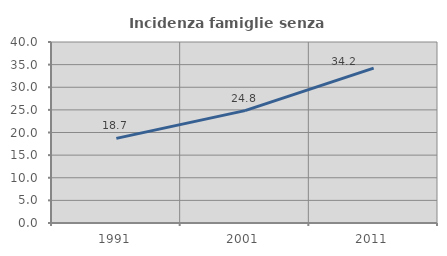
| Category | Incidenza famiglie senza nuclei |
|---|---|
| 1991.0 | 18.707 |
| 2001.0 | 24.834 |
| 2011.0 | 34.234 |